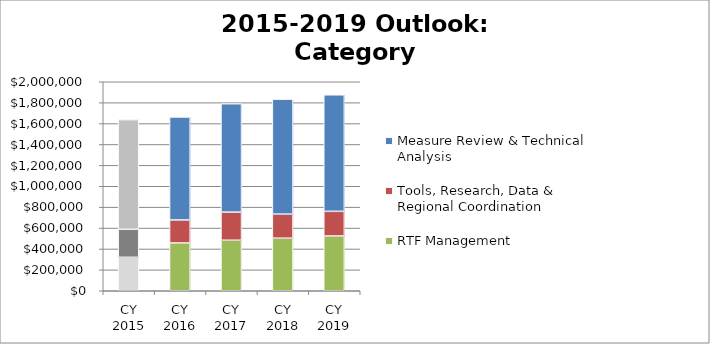
| Category | RTF Management | Tools, Research, Data & Regional Coordination | Measure Review & Technical Analysis |
|---|---|---|---|
| CY 2015 | 320100 | 268000 | 1049500 |
| CY 2016 | 457500 | 220000 | 985500 |
| CY 2017 | 483500 | 269000 | 1037300 |
| CY 2018 | 503000 | 230200 | 1100500 |
| CY 2019 | 524200 | 235900 | 1115100 |